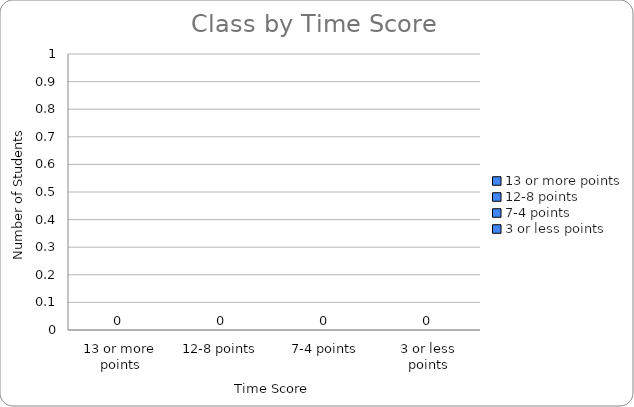
| Category | Series 0 |
|---|---|
| 13 or more points | 0 |
| 12-8 points | 0 |
| 7-4 points | 0 |
| 3 or less points | 0 |